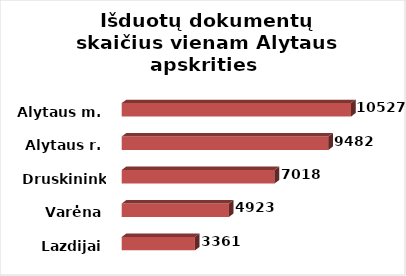
| Category | Series 0 |
|---|---|
| Lazdijai | 3361 |
| Varėna | 4923 |
| Druskininkai | 7018 |
| Alytaus r. | 9482 |
| Alytaus m. | 10527 |